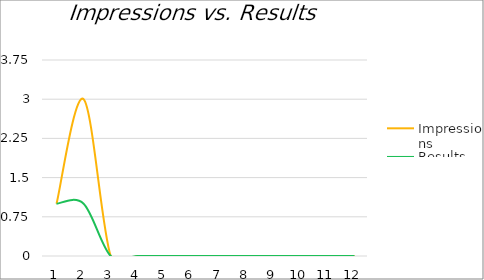
| Category | Impressions | Results |
|---|---|---|
| 1 | 1 | 1 |
| 2 | 3 | 1 |
| 3 | 0 | 0 |
| 4 | 0 | 0 |
| 5 | 0 | 0 |
| 6 | 0 | 0 |
| 7 | 0 | 0 |
| 8 | 0 | 0 |
| 9 | 0 | 0 |
| 10 | 0 | 0 |
| 11 | 0 | 0 |
| 12 | 0 | 0 |